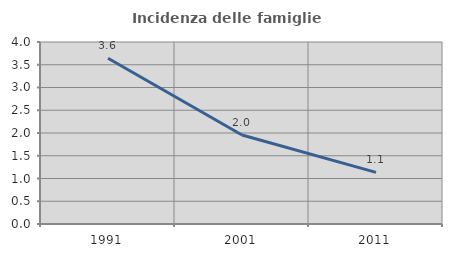
| Category | Incidenza delle famiglie numerose |
|---|---|
| 1991.0 | 3.644 |
| 2001.0 | 1.957 |
| 2011.0 | 1.134 |